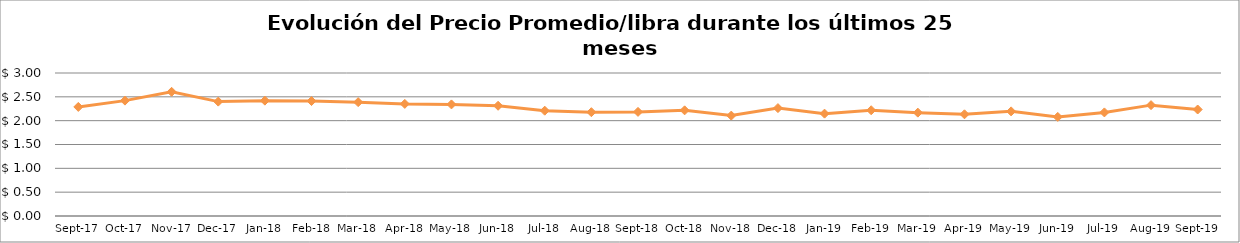
| Category | Series 0 |
|---|---|
| 2017-09-01 | 2.288 |
| 2017-10-01 | 2.421 |
| 2017-11-01 | 2.605 |
| 2017-12-01 | 2.4 |
| 2018-01-01 | 2.42 |
| 2018-02-01 | 2.412 |
| 2018-03-01 | 2.388 |
| 2018-04-01 | 2.352 |
| 2018-05-01 | 2.341 |
| 2018-06-01 | 2.312 |
| 2018-07-01 | 2.209 |
| 2018-08-01 | 2.178 |
| 2018-09-01 | 2.184 |
| 2018-10-01 | 2.216 |
| 2018-11-01 | 2.106 |
| 2018-12-01 | 2.264 |
| 2019-01-01 | 2.147 |
| 2019-02-01 | 2.218 |
| 2019-03-01 | 2.169 |
| 2019-04-01 | 2.134 |
| 2019-05-01 | 2.195 |
| 2019-06-01 | 2.079 |
| 2019-07-01 | 2.173 |
| 2019-08-01 | 2.326 |
| 2019-09-01 | 2.234 |